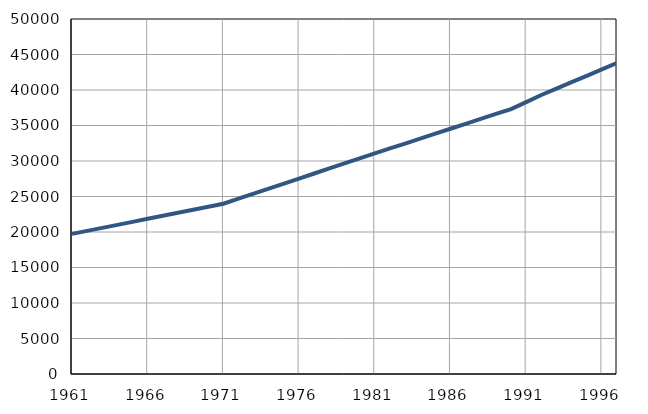
| Category | Population
size |
|---|---|
| 1961.0 | 19735 |
| 1962.0 | 20159 |
| 1963.0 | 20583 |
| 1964.0 | 21007 |
| 1965.0 | 21431 |
| 1966.0 | 21855 |
| 1967.0 | 22279 |
| 1968.0 | 22703 |
| 1969.0 | 23127 |
| 1970.0 | 23551 |
| 1971.0 | 23977 |
| 1972.0 | 24687 |
| 1973.0 | 25397 |
| 1974.0 | 26107 |
| 1975.0 | 26817 |
| 1976.0 | 27527 |
| 1977.0 | 28237 |
| 1978.0 | 28947 |
| 1979.0 | 29657 |
| 1980.0 | 30367 |
| 1981.0 | 31072 |
| 1982.0 | 31766 |
| 1983.0 | 32460 |
| 1984.0 | 33154 |
| 1985.0 | 33848 |
| 1986.0 | 34542 |
| 1987.0 | 35236 |
| 1988.0 | 35930 |
| 1989.0 | 36624 |
| 1990.0 | 37318 |
| 1991.0 | 38300 |
| 1992.0 | 39300 |
| 1993.0 | 40200 |
| 1994.0 | 41100 |
| 1995.0 | 42000 |
| 1996.0 | 42900 |
| 1997.0 | 43800 |